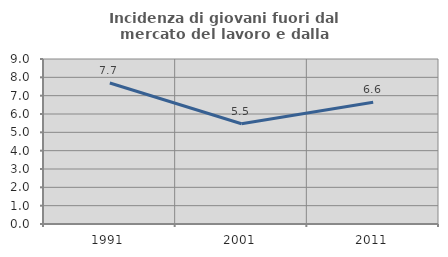
| Category | Incidenza di giovani fuori dal mercato del lavoro e dalla formazione  |
|---|---|
| 1991.0 | 7.692 |
| 2001.0 | 5.465 |
| 2011.0 | 6.641 |